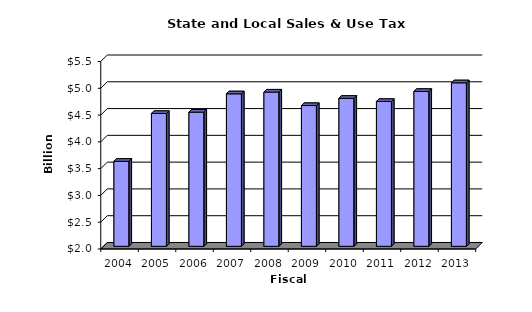
| Category | Series 0 |
|---|---|
| 2004.0 | 3.587 |
| 2005.0 | 4.48 |
| 2006.0 | 4.505 |
| 2007.0 | 4.847 |
| 2008.0 | 4.88 |
| 2009.0 | 4.628 |
| 2010.0 | 4.762 |
| 2011.0 | 4.704 |
| 2012.0 | 4.891 |
| 2013.0 | 5.052 |